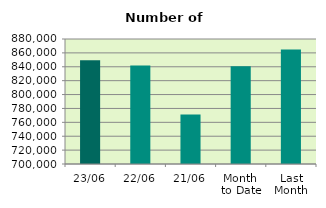
| Category | Series 0 |
|---|---|
| 23/06 | 849434 |
| 22/06 | 842016 |
| 21/06 | 771282 |
| Month 
to Date | 840872.235 |
| Last
Month | 864947.091 |